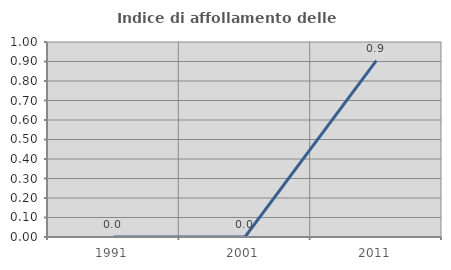
| Category | Indice di affollamento delle abitazioni  |
|---|---|
| 1991.0 | 0 |
| 2001.0 | 0 |
| 2011.0 | 0.905 |